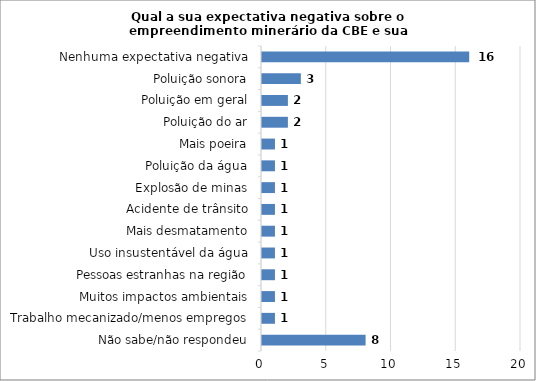
| Category | Series 0 |
|---|---|
| Não sabe/não respondeu | 8 |
| Trabalho mecanizado/menos empregos | 1 |
| Muitos impactos ambientais | 1 |
| Pessoas estranhas na região | 1 |
| Uso insustentável da água | 1 |
| Mais desmatamento | 1 |
| Acidente de trânsito | 1 |
| Explosão de minas | 1 |
| Poluição da água | 1 |
| Mais poeira | 1 |
| Poluição do ar | 2 |
| Poluição em geral | 2 |
| Poluição sonora | 3 |
| Nenhuma expectativa negativa | 16 |